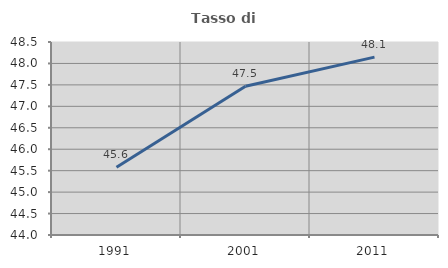
| Category | Tasso di occupazione   |
|---|---|
| 1991.0 | 45.58 |
| 2001.0 | 47.47 |
| 2011.0 | 48.148 |